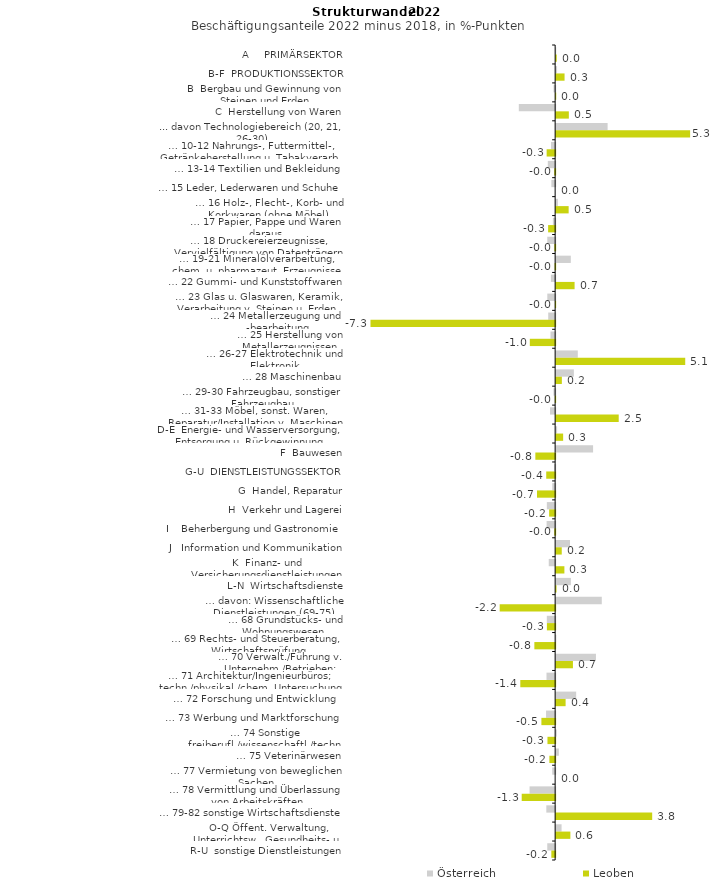
| Category | Österreich | Leoben |
|---|---|---|
| A     PRIMÄRSEKTOR | 0.004 | 0.024 |
| B-F  PRODUKTIONSSEKTOR | 0.036 | 0.335 |
| B  Bergbau und Gewinnung von Steinen und Erden | -0.063 | 0.004 |
| C  Herstellung von Waren | -1.445 | 0.505 |
| ... davon Technologiebereich (20, 21, 26-30) | 2.047 | 5.329 |
| … 10-12 Nahrungs-, Futtermittel-, Getränkeherstellung u. Tabakverarb. | -0.163 | -0.338 |
| … 13-14 Textilien und Bekleidung | -0.292 | -0.037 |
| … 15 Leder, Lederwaren und Schuhe | -0.15 | 0 |
| … 16 Holz-, Flecht-, Korb- und Korkwaren (ohne Möbel)  | 0.068 | 0.497 |
| … 17 Papier, Pappe und Waren daraus  | -0.09 | -0.279 |
| … 18 Druckereierzeugnisse, Vervielfältigung von Datenträgern | -0.314 | -0.032 |
| … 19-21 Mineralölverarbeitung, chem. u. pharmazeut. Erzeugnisse | 0.584 | -0.021 |
| … 22 Gummi- und Kunststoffwaren | -0.168 | 0.734 |
| … 23 Glas u. Glaswaren, Keramik, Verarbeitung v. Steinen u. Erden  | -0.312 | -0.008 |
| … 24 Metallerzeugung und -bearbeitung | -0.276 | -7.344 |
| … 25 Herstellung von Metallerzeugnissen  | -0.185 | -1.007 |
| … 26-27 Elektrotechnik und Elektronik | 0.862 | 5.134 |
| … 28 Maschinenbau | 0.705 | 0.227 |
| … 29-30 Fahrzeugbau, sonstiger Fahrzeugbau | -0.066 | -0.012 |
| … 31-33 Möbel, sonst. Waren, Reparatur/Installation v. Maschinen | -0.204 | 2.489 |
| D-E  Energie- und Wasserversorgung, Entsorgung u. Rückgewinnung | 0.038 | 0.278 |
| F  Bauwesen | 1.469 | -0.787 |
| G-U  DIENSTLEISTUNGSSEKTOR | -0.04 | -0.355 |
| G  Handel, Reparatur | -0.115 | -0.722 |
| H  Verkehr und Lagerei | -0.33 | -0.239 |
| I    Beherbergung und Gastronomie | -0.34 | -0.036 |
| J   Information und Kommunikation | 0.551 | 0.223 |
| K  Finanz- und Versicherungsdienstleistungen | -0.255 | 0.328 |
| L-N  Wirtschaftsdienste | 0.586 | 0.016 |
| … davon: Wissenschaftliche Dienstleistungen (69-75) | 1.815 | -2.206 |
| … 68 Grundstücks- und Wohnungswesen  | -0.331 | -0.328 |
| … 69 Rechts- und Steuerberatung, Wirtschaftsprüfung | 0.008 | -0.827 |
| … 70 Verwalt./Führung v. Unternehm./Betrieben; Unternehmensberat. | 1.583 | 0.668 |
| … 71 Architektur/Ingenieurbüros; techn./physikal./chem. Untersuchung | -0.344 | -1.385 |
| … 72 Forschung und Entwicklung  | 0.797 | 0.376 |
| … 73 Werbung und Marktforschung | -0.361 | -0.547 |
| … 74 Sonstige freiberufl./wissenschaftl./techn. Tätigkeiten | 0.025 | -0.305 |
| … 75 Veterinärwesen | 0.108 | -0.23 |
| … 77 Vermietung von beweglichen Sachen  | -0.116 | 0 |
| … 78 Vermittlung und Überlassung von Arbeitskräften | -1.018 | -1.33 |
| … 79-82 sonstige Wirtschaftsdienste | -0.351 | 3.82 |
| O-Q Öffent. Verwaltung, Unterrichtsw., Gesundheits- u. Sozialwesen | 0.216 | 0.567 |
| R-U  sonstige Dienstleistungen | -0.314 | -0.151 |